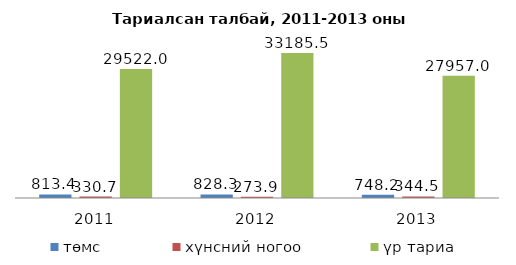
| Category | төмс | хүнсний ногоо | үр тариа |
|---|---|---|---|
| 2011.0 | 813.4 | 330.7 | 29522 |
| 2012.0 | 828.3 | 273.9 | 33185.5 |
| 2013.0 | 748.2 | 344.5 | 27957 |